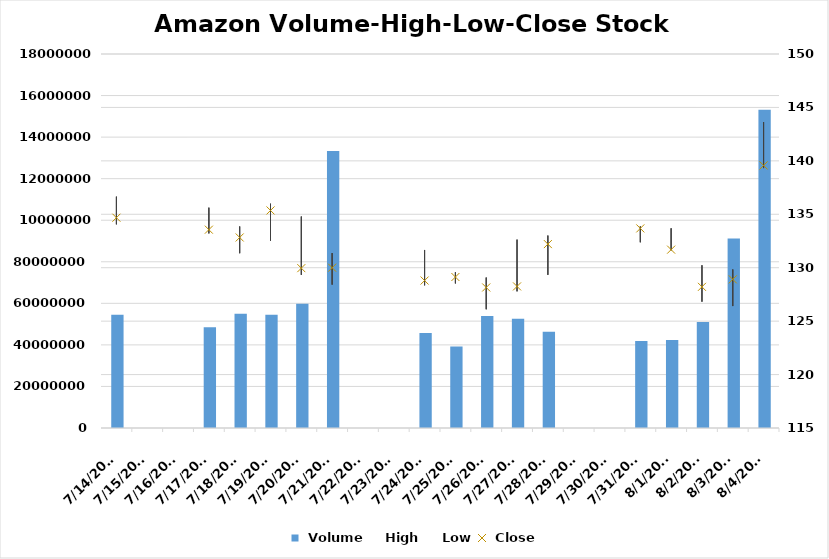
| Category |  Volume |
|---|---|
| 8/4/23 | 153128500 |
| 8/3/23 | 91163742 |
| 8/2/23 | 51027609 |
| 8/1/23 | 42298930 |
| 7/31/23 | 41901520 |
| 7/28/23 | 46317379 |
| 7/27/23 | 52610660 |
| 7/26/23 | 53910090 |
| 7/25/23 | 39236660 |
| 7/24/23 | 45671539 |
| 7/21/23 | 133307297 |
| 7/20/23 | 59820578 |
| 7/19/23 | 54531039 |
| 7/18/23 | 54969129 |
| 7/17/23 | 48450199 |
| 7/14/23 | 54487090 |